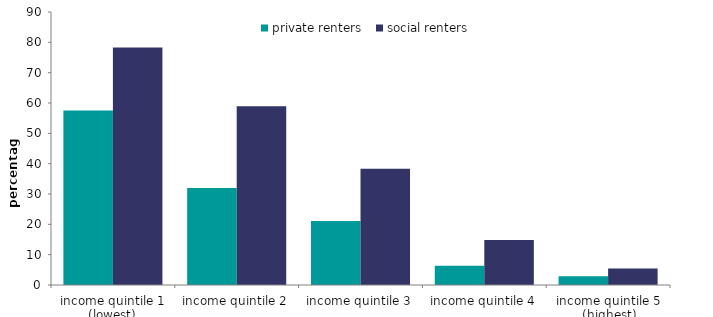
| Category | private renters | social renters |
|---|---|---|
| income quintile 1 (lowest) | 57.51 | 78.302 |
| income quintile 2 | 31.967 | 58.955 |
| income quintile 3 | 21.109 | 38.362 |
| income quintile 4 | 6.339 | 14.851 |
| income quintile 5 (highest) | 2.904 | 5.442 |